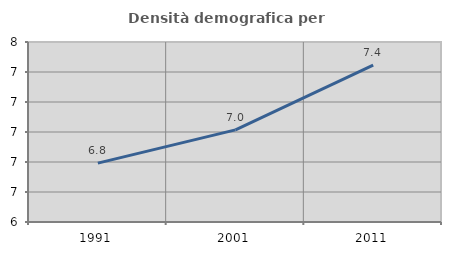
| Category | Densità demografica |
|---|---|
| 1991.0 | 6.793 |
| 2001.0 | 7.014 |
| 2011.0 | 7.446 |